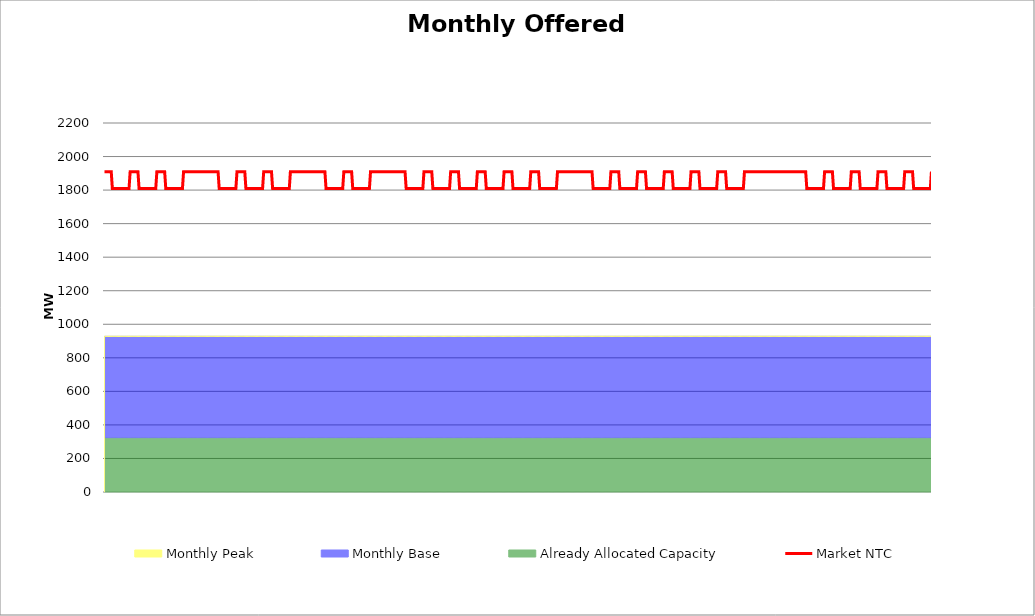
| Category | Market NTC |
|---|---|
| 0 | 1910 |
| 1 | 1910 |
| 2 | 1910 |
| 3 | 1910 |
| 4 | 1910 |
| 5 | 1910 |
| 6 | 1910 |
| 7 | 1810 |
| 8 | 1810 |
| 9 | 1810 |
| 10 | 1810 |
| 11 | 1810 |
| 12 | 1810 |
| 13 | 1810 |
| 14 | 1810 |
| 15 | 1810 |
| 16 | 1810 |
| 17 | 1810 |
| 18 | 1810 |
| 19 | 1810 |
| 20 | 1810 |
| 21 | 1810 |
| 22 | 1810 |
| 23 | 1910 |
| 24 | 1910 |
| 25 | 1910 |
| 26 | 1910 |
| 27 | 1910 |
| 28 | 1910 |
| 29 | 1910 |
| 30 | 1910 |
| 31 | 1810 |
| 32 | 1810 |
| 33 | 1810 |
| 34 | 1810 |
| 35 | 1810 |
| 36 | 1810 |
| 37 | 1810 |
| 38 | 1810 |
| 39 | 1810 |
| 40 | 1810 |
| 41 | 1810 |
| 42 | 1810 |
| 43 | 1810 |
| 44 | 1810 |
| 45 | 1810 |
| 46 | 1810 |
| 47 | 1910 |
| 48 | 1910 |
| 49 | 1910 |
| 50 | 1910 |
| 51 | 1910 |
| 52 | 1910 |
| 53 | 1910 |
| 54 | 1910 |
| 55 | 1810 |
| 56 | 1810 |
| 57 | 1810 |
| 58 | 1810 |
| 59 | 1810 |
| 60 | 1810 |
| 61 | 1810 |
| 62 | 1810 |
| 63 | 1810 |
| 64 | 1810 |
| 65 | 1810 |
| 66 | 1810 |
| 67 | 1810 |
| 68 | 1810 |
| 69 | 1810 |
| 70 | 1810 |
| 71 | 1910 |
| 72 | 1910 |
| 73 | 1910 |
| 74 | 1910 |
| 75 | 1910 |
| 76 | 1910 |
| 77 | 1910 |
| 78 | 1910 |
| 79 | 1910 |
| 80 | 1910 |
| 81 | 1910 |
| 82 | 1910 |
| 83 | 1910 |
| 84 | 1910 |
| 85 | 1910 |
| 86 | 1910 |
| 87 | 1910 |
| 88 | 1910 |
| 89 | 1910 |
| 90 | 1910 |
| 91 | 1910 |
| 92 | 1910 |
| 93 | 1910 |
| 94 | 1910 |
| 95 | 1910 |
| 96 | 1910 |
| 97 | 1910 |
| 98 | 1910 |
| 99 | 1910 |
| 100 | 1910 |
| 101 | 1910 |
| 102 | 1910 |
| 103 | 1810 |
| 104 | 1810 |
| 105 | 1810 |
| 106 | 1810 |
| 107 | 1810 |
| 108 | 1810 |
| 109 | 1810 |
| 110 | 1810 |
| 111 | 1810 |
| 112 | 1810 |
| 113 | 1810 |
| 114 | 1810 |
| 115 | 1810 |
| 116 | 1810 |
| 117 | 1810 |
| 118 | 1810 |
| 119 | 1910 |
| 120 | 1910 |
| 121 | 1910 |
| 122 | 1910 |
| 123 | 1910 |
| 124 | 1910 |
| 125 | 1910 |
| 126 | 1910 |
| 127 | 1810 |
| 128 | 1810 |
| 129 | 1810 |
| 130 | 1810 |
| 131 | 1810 |
| 132 | 1810 |
| 133 | 1810 |
| 134 | 1810 |
| 135 | 1810 |
| 136 | 1810 |
| 137 | 1810 |
| 138 | 1810 |
| 139 | 1810 |
| 140 | 1810 |
| 141 | 1810 |
| 142 | 1810 |
| 143 | 1910 |
| 144 | 1910 |
| 145 | 1910 |
| 146 | 1910 |
| 147 | 1910 |
| 148 | 1910 |
| 149 | 1910 |
| 150 | 1910 |
| 151 | 1810 |
| 152 | 1810 |
| 153 | 1810 |
| 154 | 1810 |
| 155 | 1810 |
| 156 | 1810 |
| 157 | 1810 |
| 158 | 1810 |
| 159 | 1810 |
| 160 | 1810 |
| 161 | 1810 |
| 162 | 1810 |
| 163 | 1810 |
| 164 | 1810 |
| 165 | 1810 |
| 166 | 1810 |
| 167 | 1910 |
| 168 | 1910 |
| 169 | 1910 |
| 170 | 1910 |
| 171 | 1910 |
| 172 | 1910 |
| 173 | 1910 |
| 174 | 1910 |
| 175 | 1910 |
| 176 | 1910 |
| 177 | 1910 |
| 178 | 1910 |
| 179 | 1910 |
| 180 | 1910 |
| 181 | 1910 |
| 182 | 1910 |
| 183 | 1910 |
| 184 | 1910 |
| 185 | 1910 |
| 186 | 1910 |
| 187 | 1910 |
| 188 | 1910 |
| 189 | 1910 |
| 190 | 1910 |
| 191 | 1910 |
| 192 | 1910 |
| 193 | 1910 |
| 194 | 1910 |
| 195 | 1910 |
| 196 | 1910 |
| 197 | 1910 |
| 198 | 1910 |
| 199 | 1810 |
| 200 | 1810 |
| 201 | 1810 |
| 202 | 1810 |
| 203 | 1810 |
| 204 | 1810 |
| 205 | 1810 |
| 206 | 1810 |
| 207 | 1810 |
| 208 | 1810 |
| 209 | 1810 |
| 210 | 1810 |
| 211 | 1810 |
| 212 | 1810 |
| 213 | 1810 |
| 214 | 1810 |
| 215 | 1910 |
| 216 | 1910 |
| 217 | 1910 |
| 218 | 1910 |
| 219 | 1910 |
| 220 | 1910 |
| 221 | 1910 |
| 222 | 1910 |
| 223 | 1810 |
| 224 | 1810 |
| 225 | 1810 |
| 226 | 1810 |
| 227 | 1810 |
| 228 | 1810 |
| 229 | 1810 |
| 230 | 1810 |
| 231 | 1810 |
| 232 | 1810 |
| 233 | 1810 |
| 234 | 1810 |
| 235 | 1810 |
| 236 | 1810 |
| 237 | 1810 |
| 238 | 1810 |
| 239 | 1910 |
| 240 | 1910 |
| 241 | 1910 |
| 242 | 1910 |
| 243 | 1910 |
| 244 | 1910 |
| 245 | 1910 |
| 246 | 1910 |
| 247 | 1910 |
| 248 | 1910 |
| 249 | 1910 |
| 250 | 1910 |
| 251 | 1910 |
| 252 | 1910 |
| 253 | 1910 |
| 254 | 1910 |
| 255 | 1910 |
| 256 | 1910 |
| 257 | 1910 |
| 258 | 1910 |
| 259 | 1910 |
| 260 | 1910 |
| 261 | 1910 |
| 262 | 1910 |
| 263 | 1910 |
| 264 | 1910 |
| 265 | 1910 |
| 266 | 1910 |
| 267 | 1910 |
| 268 | 1910 |
| 269 | 1910 |
| 270 | 1910 |
| 271 | 1810 |
| 272 | 1810 |
| 273 | 1810 |
| 274 | 1810 |
| 275 | 1810 |
| 276 | 1810 |
| 277 | 1810 |
| 278 | 1810 |
| 279 | 1810 |
| 280 | 1810 |
| 281 | 1810 |
| 282 | 1810 |
| 283 | 1810 |
| 284 | 1810 |
| 285 | 1810 |
| 286 | 1810 |
| 287 | 1910 |
| 288 | 1910 |
| 289 | 1910 |
| 290 | 1910 |
| 291 | 1910 |
| 292 | 1910 |
| 293 | 1910 |
| 294 | 1910 |
| 295 | 1810 |
| 296 | 1810 |
| 297 | 1810 |
| 298 | 1810 |
| 299 | 1810 |
| 300 | 1810 |
| 301 | 1810 |
| 302 | 1810 |
| 303 | 1810 |
| 304 | 1810 |
| 305 | 1810 |
| 306 | 1810 |
| 307 | 1810 |
| 308 | 1810 |
| 309 | 1810 |
| 310 | 1810 |
| 311 | 1910 |
| 312 | 1910 |
| 313 | 1910 |
| 314 | 1910 |
| 315 | 1910 |
| 316 | 1910 |
| 317 | 1910 |
| 318 | 1910 |
| 319 | 1810 |
| 320 | 1810 |
| 321 | 1810 |
| 322 | 1810 |
| 323 | 1810 |
| 324 | 1810 |
| 325 | 1810 |
| 326 | 1810 |
| 327 | 1810 |
| 328 | 1810 |
| 329 | 1810 |
| 330 | 1810 |
| 331 | 1810 |
| 332 | 1810 |
| 333 | 1810 |
| 334 | 1810 |
| 335 | 1910 |
| 336 | 1910 |
| 337 | 1910 |
| 338 | 1910 |
| 339 | 1910 |
| 340 | 1910 |
| 341 | 1910 |
| 342 | 1910 |
| 343 | 1810 |
| 344 | 1810 |
| 345 | 1810 |
| 346 | 1810 |
| 347 | 1810 |
| 348 | 1810 |
| 349 | 1810 |
| 350 | 1810 |
| 351 | 1810 |
| 352 | 1810 |
| 353 | 1810 |
| 354 | 1810 |
| 355 | 1810 |
| 356 | 1810 |
| 357 | 1810 |
| 358 | 1810 |
| 359 | 1910 |
| 360 | 1910 |
| 361 | 1910 |
| 362 | 1910 |
| 363 | 1910 |
| 364 | 1910 |
| 365 | 1910 |
| 366 | 1910 |
| 367 | 1810 |
| 368 | 1810 |
| 369 | 1810 |
| 370 | 1810 |
| 371 | 1810 |
| 372 | 1810 |
| 373 | 1810 |
| 374 | 1810 |
| 375 | 1810 |
| 376 | 1810 |
| 377 | 1810 |
| 378 | 1810 |
| 379 | 1810 |
| 380 | 1810 |
| 381 | 1810 |
| 382 | 1810 |
| 383 | 1910 |
| 384 | 1910 |
| 385 | 1910 |
| 386 | 1910 |
| 387 | 1910 |
| 388 | 1910 |
| 389 | 1910 |
| 390 | 1910 |
| 391 | 1810 |
| 392 | 1810 |
| 393 | 1810 |
| 394 | 1810 |
| 395 | 1810 |
| 396 | 1810 |
| 397 | 1810 |
| 398 | 1810 |
| 399 | 1810 |
| 400 | 1810 |
| 401 | 1810 |
| 402 | 1810 |
| 403 | 1810 |
| 404 | 1810 |
| 405 | 1810 |
| 406 | 1810 |
| 407 | 1910 |
| 408 | 1910 |
| 409 | 1910 |
| 410 | 1910 |
| 411 | 1910 |
| 412 | 1910 |
| 413 | 1910 |
| 414 | 1910 |
| 415 | 1910 |
| 416 | 1910 |
| 417 | 1910 |
| 418 | 1910 |
| 419 | 1910 |
| 420 | 1910 |
| 421 | 1910 |
| 422 | 1910 |
| 423 | 1910 |
| 424 | 1910 |
| 425 | 1910 |
| 426 | 1910 |
| 427 | 1910 |
| 428 | 1910 |
| 429 | 1910 |
| 430 | 1910 |
| 431 | 1910 |
| 432 | 1910 |
| 433 | 1910 |
| 434 | 1910 |
| 435 | 1910 |
| 436 | 1910 |
| 437 | 1910 |
| 438 | 1910 |
| 439 | 1810 |
| 440 | 1810 |
| 441 | 1810 |
| 442 | 1810 |
| 443 | 1810 |
| 444 | 1810 |
| 445 | 1810 |
| 446 | 1810 |
| 447 | 1810 |
| 448 | 1810 |
| 449 | 1810 |
| 450 | 1810 |
| 451 | 1810 |
| 452 | 1810 |
| 453 | 1810 |
| 454 | 1810 |
| 455 | 1910 |
| 456 | 1910 |
| 457 | 1910 |
| 458 | 1910 |
| 459 | 1910 |
| 460 | 1910 |
| 461 | 1910 |
| 462 | 1910 |
| 463 | 1810 |
| 464 | 1810 |
| 465 | 1810 |
| 466 | 1810 |
| 467 | 1810 |
| 468 | 1810 |
| 469 | 1810 |
| 470 | 1810 |
| 471 | 1810 |
| 472 | 1810 |
| 473 | 1810 |
| 474 | 1810 |
| 475 | 1810 |
| 476 | 1810 |
| 477 | 1810 |
| 478 | 1810 |
| 479 | 1910 |
| 480 | 1910 |
| 481 | 1910 |
| 482 | 1910 |
| 483 | 1910 |
| 484 | 1910 |
| 485 | 1910 |
| 486 | 1910 |
| 487 | 1810 |
| 488 | 1810 |
| 489 | 1810 |
| 490 | 1810 |
| 491 | 1810 |
| 492 | 1810 |
| 493 | 1810 |
| 494 | 1810 |
| 495 | 1810 |
| 496 | 1810 |
| 497 | 1810 |
| 498 | 1810 |
| 499 | 1810 |
| 500 | 1810 |
| 501 | 1810 |
| 502 | 1810 |
| 503 | 1910 |
| 504 | 1910 |
| 505 | 1910 |
| 506 | 1910 |
| 507 | 1910 |
| 508 | 1910 |
| 509 | 1910 |
| 510 | 1910 |
| 511 | 1810 |
| 512 | 1810 |
| 513 | 1810 |
| 514 | 1810 |
| 515 | 1810 |
| 516 | 1810 |
| 517 | 1810 |
| 518 | 1810 |
| 519 | 1810 |
| 520 | 1810 |
| 521 | 1810 |
| 522 | 1810 |
| 523 | 1810 |
| 524 | 1810 |
| 525 | 1810 |
| 526 | 1810 |
| 527 | 1910 |
| 528 | 1910 |
| 529 | 1910 |
| 530 | 1910 |
| 531 | 1910 |
| 532 | 1910 |
| 533 | 1910 |
| 534 | 1910 |
| 535 | 1810 |
| 536 | 1810 |
| 537 | 1810 |
| 538 | 1810 |
| 539 | 1810 |
| 540 | 1810 |
| 541 | 1810 |
| 542 | 1810 |
| 543 | 1810 |
| 544 | 1810 |
| 545 | 1810 |
| 546 | 1810 |
| 547 | 1810 |
| 548 | 1810 |
| 549 | 1810 |
| 550 | 1810 |
| 551 | 1910 |
| 552 | 1910 |
| 553 | 1910 |
| 554 | 1910 |
| 555 | 1910 |
| 556 | 1910 |
| 557 | 1910 |
| 558 | 1910 |
| 559 | 1810 |
| 560 | 1810 |
| 561 | 1810 |
| 562 | 1810 |
| 563 | 1810 |
| 564 | 1810 |
| 565 | 1810 |
| 566 | 1810 |
| 567 | 1810 |
| 568 | 1810 |
| 569 | 1810 |
| 570 | 1810 |
| 571 | 1810 |
| 572 | 1810 |
| 573 | 1810 |
| 574 | 1810 |
| 575 | 1910 |
| 576 | 1910 |
| 577 | 1910 |
| 578 | 1910 |
| 579 | 1910 |
| 580 | 1910 |
| 581 | 1910 |
| 582 | 1910 |
| 583 | 1910 |
| 584 | 1910 |
| 585 | 1910 |
| 586 | 1910 |
| 587 | 1910 |
| 588 | 1910 |
| 589 | 1910 |
| 590 | 1910 |
| 591 | 1910 |
| 592 | 1910 |
| 593 | 1910 |
| 594 | 1910 |
| 595 | 1910 |
| 596 | 1910 |
| 597 | 1910 |
| 598 | 1910 |
| 599 | 1910 |
| 600 | 1910 |
| 601 | 1910 |
| 602 | 1910 |
| 603 | 1910 |
| 604 | 1910 |
| 605 | 1910 |
| 606 | 1910 |
| 607 | 1910 |
| 608 | 1910 |
| 609 | 1910 |
| 610 | 1910 |
| 611 | 1910 |
| 612 | 1910 |
| 613 | 1910 |
| 614 | 1910 |
| 615 | 1910 |
| 616 | 1910 |
| 617 | 1910 |
| 618 | 1910 |
| 619 | 1910 |
| 620 | 1910 |
| 621 | 1910 |
| 622 | 1910 |
| 623 | 1910 |
| 624 | 1910 |
| 625 | 1910 |
| 626 | 1910 |
| 627 | 1910 |
| 628 | 1910 |
| 629 | 1910 |
| 630 | 1910 |
| 631 | 1810 |
| 632 | 1810 |
| 633 | 1810 |
| 634 | 1810 |
| 635 | 1810 |
| 636 | 1810 |
| 637 | 1810 |
| 638 | 1810 |
| 639 | 1810 |
| 640 | 1810 |
| 641 | 1810 |
| 642 | 1810 |
| 643 | 1810 |
| 644 | 1810 |
| 645 | 1810 |
| 646 | 1810 |
| 647 | 1910 |
| 648 | 1910 |
| 649 | 1910 |
| 650 | 1910 |
| 651 | 1910 |
| 652 | 1910 |
| 653 | 1910 |
| 654 | 1910 |
| 655 | 1810 |
| 656 | 1810 |
| 657 | 1810 |
| 658 | 1810 |
| 659 | 1810 |
| 660 | 1810 |
| 661 | 1810 |
| 662 | 1810 |
| 663 | 1810 |
| 664 | 1810 |
| 665 | 1810 |
| 666 | 1810 |
| 667 | 1810 |
| 668 | 1810 |
| 669 | 1810 |
| 670 | 1810 |
| 671 | 1910 |
| 672 | 1910 |
| 673 | 1910 |
| 674 | 1910 |
| 675 | 1910 |
| 676 | 1910 |
| 677 | 1910 |
| 678 | 1910 |
| 679 | 1810 |
| 680 | 1810 |
| 681 | 1810 |
| 682 | 1810 |
| 683 | 1810 |
| 684 | 1810 |
| 685 | 1810 |
| 686 | 1810 |
| 687 | 1810 |
| 688 | 1810 |
| 689 | 1810 |
| 690 | 1810 |
| 691 | 1810 |
| 692 | 1810 |
| 693 | 1810 |
| 694 | 1810 |
| 695 | 1910 |
| 696 | 1910 |
| 697 | 1910 |
| 698 | 1910 |
| 699 | 1910 |
| 700 | 1910 |
| 701 | 1910 |
| 702 | 1910 |
| 703 | 1810 |
| 704 | 1810 |
| 705 | 1810 |
| 706 | 1810 |
| 707 | 1810 |
| 708 | 1810 |
| 709 | 1810 |
| 710 | 1810 |
| 711 | 1810 |
| 712 | 1810 |
| 713 | 1810 |
| 714 | 1810 |
| 715 | 1810 |
| 716 | 1810 |
| 717 | 1810 |
| 718 | 1810 |
| 719 | 1910 |
| 720 | 1910 |
| 721 | 1910 |
| 722 | 1910 |
| 723 | 1910 |
| 724 | 1910 |
| 725 | 1910 |
| 726 | 1910 |
| 727 | 1810 |
| 728 | 1810 |
| 729 | 1810 |
| 730 | 1810 |
| 731 | 1810 |
| 732 | 1810 |
| 733 | 1810 |
| 734 | 1810 |
| 735 | 1810 |
| 736 | 1810 |
| 737 | 1810 |
| 738 | 1810 |
| 739 | 1810 |
| 740 | 1810 |
| 741 | 1810 |
| 742 | 1810 |
| 743 | 1910 |